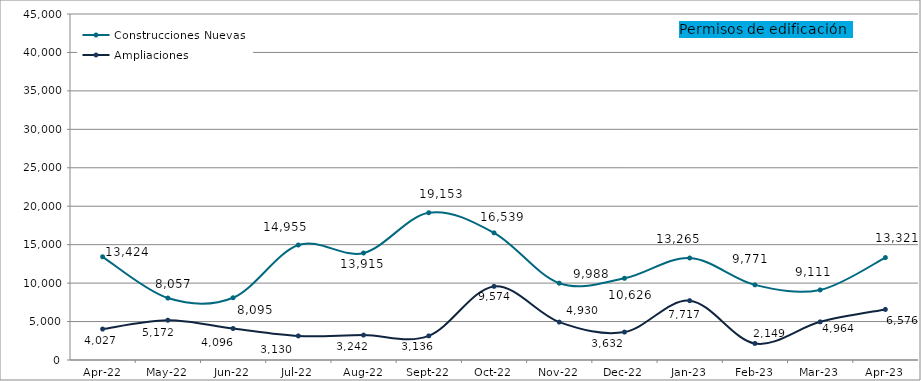
| Category | Construcciones Nuevas | Ampliaciones |
|---|---|---|
| 2022-04-01 | 13424 | 4027 |
| 2022-05-01 | 8057 | 5172 |
| 2022-06-01 | 8095 | 4096 |
| 2022-07-01 | 14955 | 3130 |
| 2022-08-01 | 13915 | 3242 |
| 2022-09-01 | 19153 | 3136 |
| 2022-10-01 | 16539 | 9574 |
| 2022-11-01 | 9988 | 4930 |
| 2022-12-01 | 10626 | 3632 |
| 2023-01-01 | 13265 | 7717 |
| 2023-02-01 | 9771 | 2149 |
| 2023-03-01 | 9111 | 4964 |
| 2023-04-01 | 13321 | 6576 |